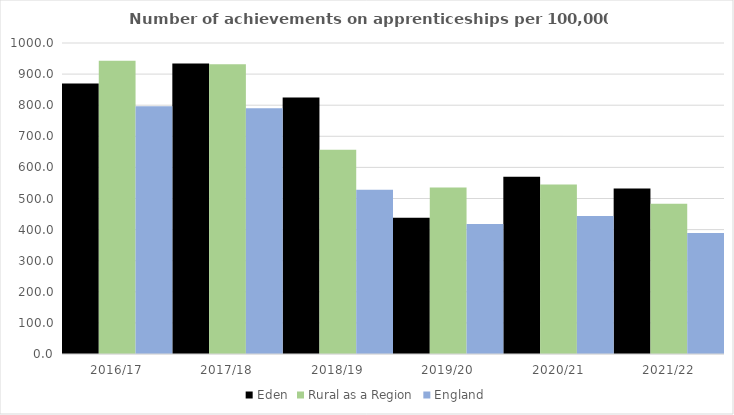
| Category | Eden | Rural as a Region | England |
|---|---|---|---|
| 2016/17 | 870 | 942.594 | 797 |
| 2017/18 | 934 | 931.709 | 790 |
| 2018/19 | 825 | 656.44 | 528 |
| 2019/20 | 438 | 535.552 | 418 |
| 2020/21 | 570 | 545.333 | 444 |
| 2021/22 | 532 | 482.936 | 389 |